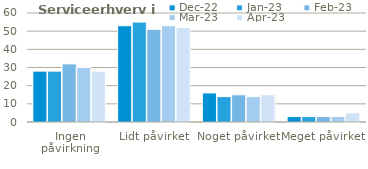
| Category | dec-22 | jan-23 | feb-23 | mar-23 | apr-23 |
|---|---|---|---|---|---|
| Ingen påvirkning | 28 | 28 | 32 | 30 | 28 |
| Lidt påvirket | 53 | 55 | 51 | 53 | 52 |
| Noget påvirket | 16 | 14 | 15 | 14 | 15 |
| Meget påvirket | 3 | 3 | 3 | 3 | 5 |